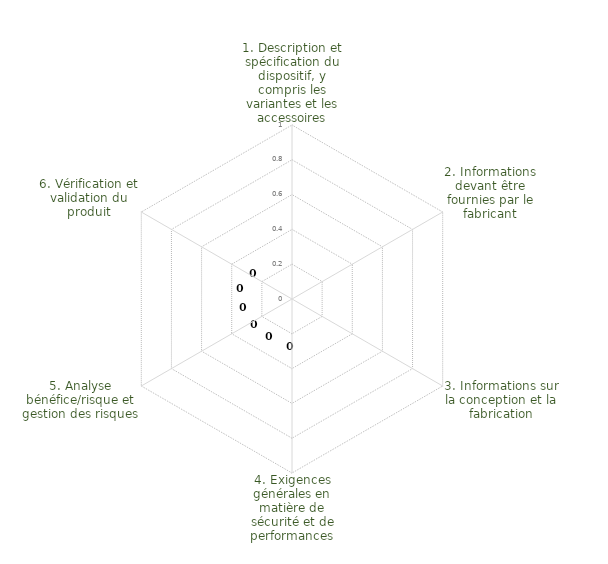
| Category | Series 0 | Series 1 | Series 2 | Series 3 | Series 4 |
|---|---|---|---|---|---|
| 1. Description et spécification du dispositif, y compris les variantes et les accessoires |  |  |  |  | 0 |
| 2. Informations devant être fournies par le fabricant |  |  |  |  | 0 |
| 3. Informations sur la conception et la fabrication |  |  |  |  | 0 |
| 4. Exigences générales en matière de sécurité et de performances |  |  |  |  | 0 |
| 5. Analyse bénéfice/risque et gestion des risques |  |  |  |  | 0 |
| 6. Vérification et validation du produit |  |  |  |  | 0 |